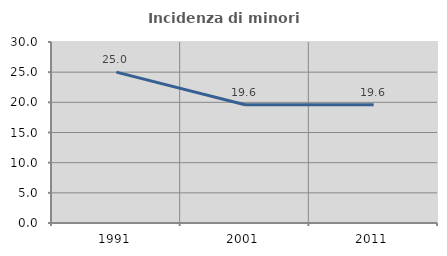
| Category | Incidenza di minori stranieri |
|---|---|
| 1991.0 | 25 |
| 2001.0 | 19.608 |
| 2011.0 | 19.608 |